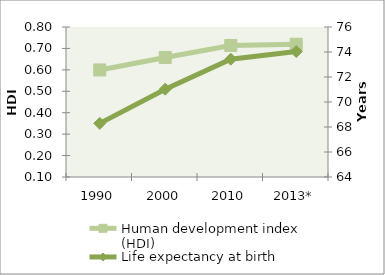
| Category | Human development index (HDI) |
|---|---|
| 1990 | 0.6 |
| 2000 | 0.658 |
| 2010 | 0.714 |
| 2013* | 0.719 |